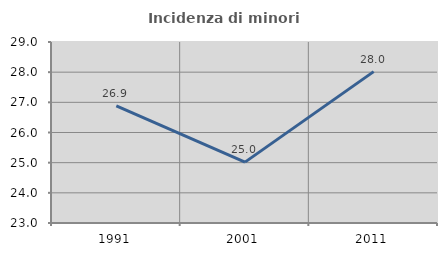
| Category | Incidenza di minori stranieri |
|---|---|
| 1991.0 | 26.885 |
| 2001.0 | 25.018 |
| 2011.0 | 28.017 |